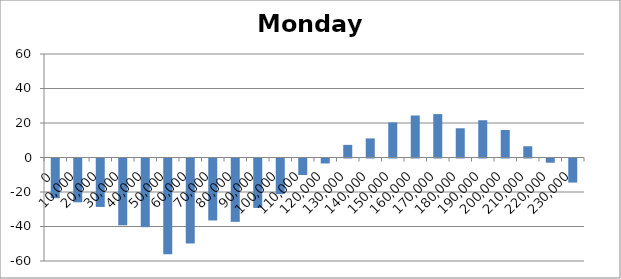
| Category | Monday 60 |
|---|---|
| 0.0 | -23 |
| 10000.0 | -25.41 |
| 20000.0 | -28.08 |
| 30000.0 | -38.73 |
| 40000.0 | -39.815 |
| 50000.0 | -55.455 |
| 60000.0 | -49.33 |
| 70000.0 | -35.925 |
| 80000.0 | -36.715 |
| 90000.0 | -28.63 |
| 100000.0 | -20.625 |
| 110000.0 | -9.59 |
| 120000.0 | -2.88 |
| 130000.0 | 7.325 |
| 140000.0 | 11.075 |
| 150000.0 | 20.33 |
| 160000.0 | 24.36 |
| 170000.0 | 25.165 |
| 180000.0 | 16.94 |
| 190000.0 | 21.595 |
| 200000.0 | 15.935 |
| 210000.0 | 6.525 |
| 220000.0 | -2.453 |
| 230000.0 | -13.96 |